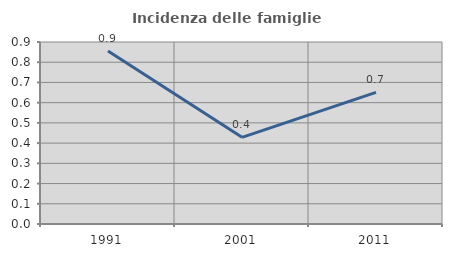
| Category | Incidenza delle famiglie numerose |
|---|---|
| 1991.0 | 0.856 |
| 2001.0 | 0.429 |
| 2011.0 | 0.651 |